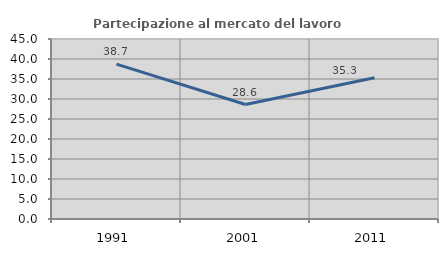
| Category | Partecipazione al mercato del lavoro  femminile |
|---|---|
| 1991.0 | 38.72 |
| 2001.0 | 28.618 |
| 2011.0 | 35.308 |